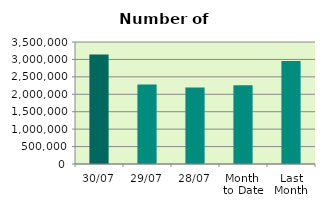
| Category | Series 0 |
|---|---|
| 30/07 | 3143250 |
| 29/07 | 2277584 |
| 28/07 | 2194570 |
| Month 
to Date | 2258947.636 |
| Last
Month | 2956123.091 |